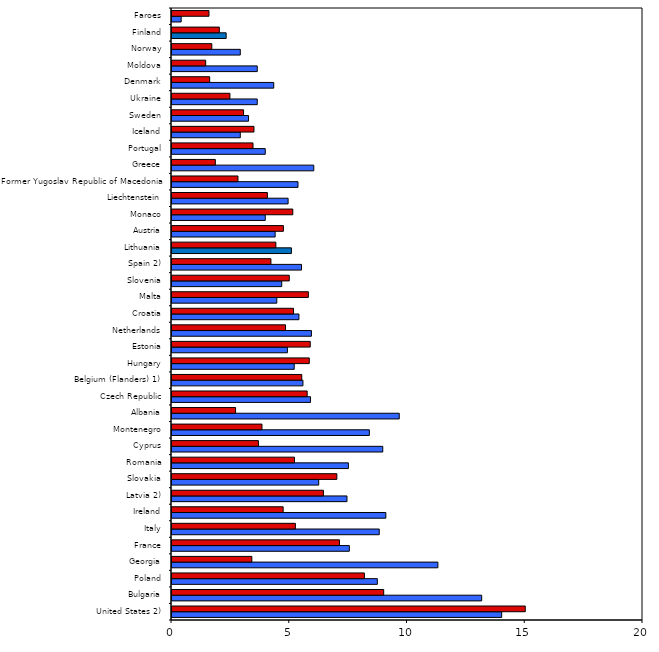
| Category | Boys | Girls |
|---|---|---|
| United States 2) | 14 | 15 |
| Bulgaria | 13.15 | 8.99 |
| Poland | 8.72 | 8.17 |
| Georgia | 11.29 | 3.39 |
| France | 7.53 | 7.11 |
| Italy | 8.8 | 5.24 |
| Ireland | 9.08 | 4.72 |
| Latvia 2) | 7.43 | 6.43 |
| Slovakia | 6.23 | 7 |
| Romania | 7.49 | 5.2 |
| Cyprus | 8.95 | 3.67 |
| Montenegro | 8.38 | 3.82 |
| Albania | 9.65 | 2.7 |
| Czech Republic | 5.88 | 5.74 |
| Belgium (Flanders) 1) | 5.56 | 5.51 |
| Hungary | 5.19 | 5.83 |
| Estonia | 4.9 | 5.87 |
| Netherlands | 5.92 | 4.82 |
| Croatia | 5.39 | 5.16 |
| Malta | 4.45 | 5.79 |
| Slovenia | 4.66 | 4.98 |
| Spain 2) | 5.5 | 4.2 |
| Lithuania | 5.07 | 4.41 |
| Austria | 4.38 | 4.73 |
| Monaco | 3.96 | 5.13 |
| Liechtenstein | 4.93 | 4.05 |
| Former Yugoslav Republic of Macedonia | 5.35 | 2.8 |
| Greece | 6.02 | 1.84 |
| Portugal | 3.96 | 3.44 |
| Iceland | 2.9 | 3.48 |
| Sweden | 3.25 | 3.04 |
| Ukraine | 3.62 | 2.46 |
| Denmark | 4.32 | 1.6 |
| Moldova | 3.62 | 1.43 |
| Norway | 2.9 | 1.69 |
| Finland | 2.3 | 2.01 |
| Faroes | 0.39 | 1.57 |